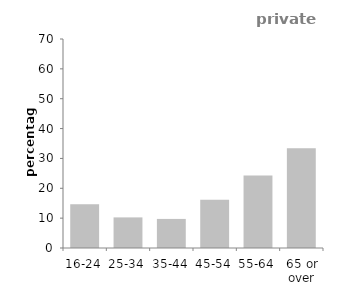
| Category | private
renters |
|---|---|
| 16-24 | 14.629 |
| 25-34 | 10.247 |
| 35-44 | 9.737 |
| 45-54 | 16.141 |
| 55-64 | 24.262 |
| 65 or over | 33.379 |